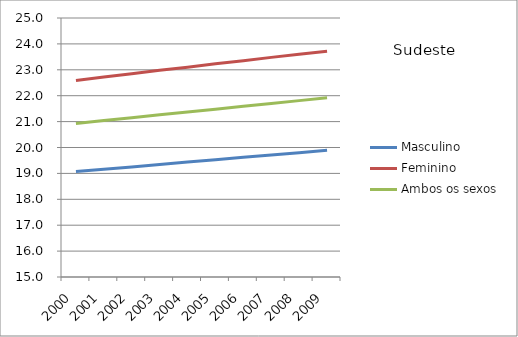
| Category | Masculino | Feminino | Ambos os sexos |
|---|---|---|---|
| 2000.0 | 19.07 | 22.59 | 20.93 |
| 2001.0 | 19.16 | 22.72 | 21.04 |
| 2002.0 | 19.25 | 22.85 | 21.15 |
| 2003.0 | 19.34 | 22.98 | 21.26 |
| 2004.0 | 19.44 | 23.1 | 21.37 |
| 2005.0 | 19.53 | 23.23 | 21.48 |
| 2006.0 | 19.62 | 23.35 | 21.59 |
| 2007.0 | 19.71 | 23.48 | 21.7 |
| 2008.0 | 19.8 | 23.6 | 21.81 |
| 2009.0 | 19.89 | 23.72 | 21.92 |